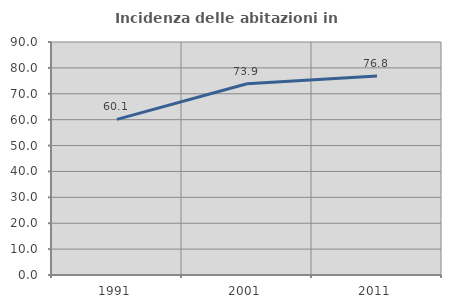
| Category | Incidenza delle abitazioni in proprietà  |
|---|---|
| 1991.0 | 60.095 |
| 2001.0 | 73.882 |
| 2011.0 | 76.821 |